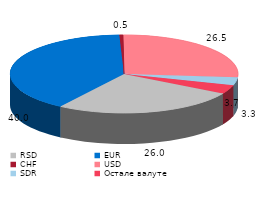
| Category | Series 0 |
|---|---|
| RSD | 26.04 |
| EUR | 40 |
| CHF | 0.5 |
| USD | 26.5 |
| SDR | 3.3 |
| Остале валуте | 3.7 |